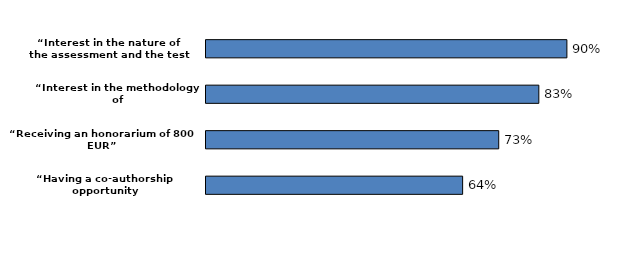
| Category | Proportion |
|---|---|
| “Having a co-authorship opportunity
in a publication” | 0.64 |
| “Receiving an honorarium of 800 EUR” | 0.73 |
| “Interest in the methodology of
assessing AI capabilities” | 0.83 |
| “Interest in the nature of 
the assessment and the test items” | 0.9 |